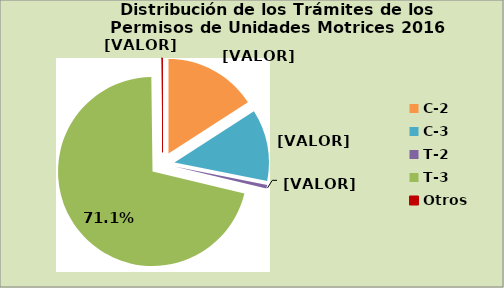
| Category | Series 0 |
|---|---|
| C-2 | 15.881 |
| C-3 | 12.235 |
| T-2 | 0.638 |
| T-3 | 71.048 |
| Otros | 0.198 |